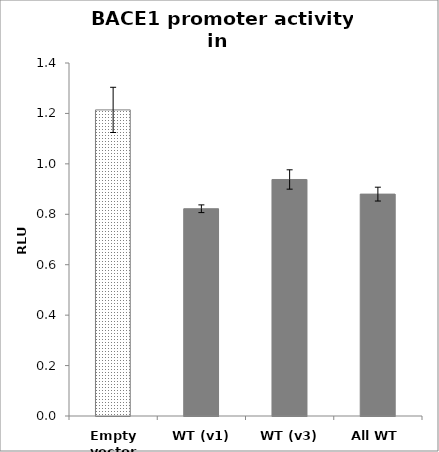
| Category | Series 0 |
|---|---|
| Empty vector | 1.214 |
| WT (v1) | 0.822 |
| WT (v3) | 0.938 |
| All WT | 0.88 |